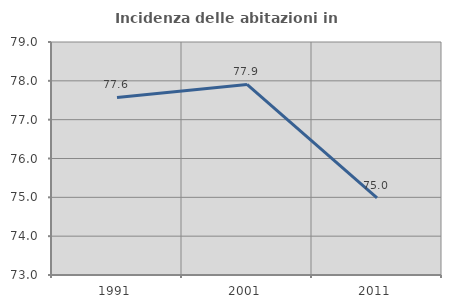
| Category | Incidenza delle abitazioni in proprietà  |
|---|---|
| 1991.0 | 77.572 |
| 2001.0 | 77.909 |
| 2011.0 | 74.986 |